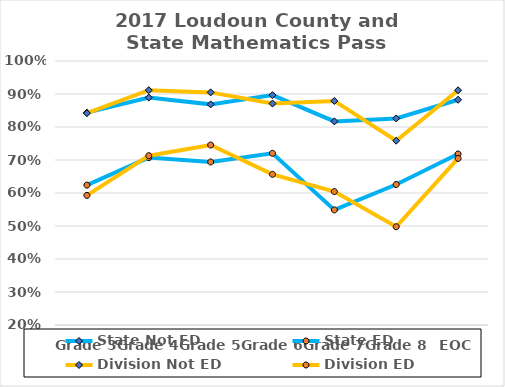
| Category | State Not ED | State ED | Division Not ED | Division ED |
|---|---|---|---|---|
| Grade 3 | 0.844 | 0.624 | 0.842 | 0.593 |
| Grade 4 | 0.889 | 0.707 | 0.912 | 0.713 |
| Grade 5 | 0.869 | 0.694 | 0.905 | 0.745 |
| Grade 6 | 0.897 | 0.72 | 0.871 | 0.656 |
| Grade 7 | 0.817 | 0.549 | 0.879 | 0.604 |
| Grade 8 | 0.826 | 0.626 | 0.758 | 0.498 |
| EOC | 0.883 | 0.718 | 0.911 | 0.705 |